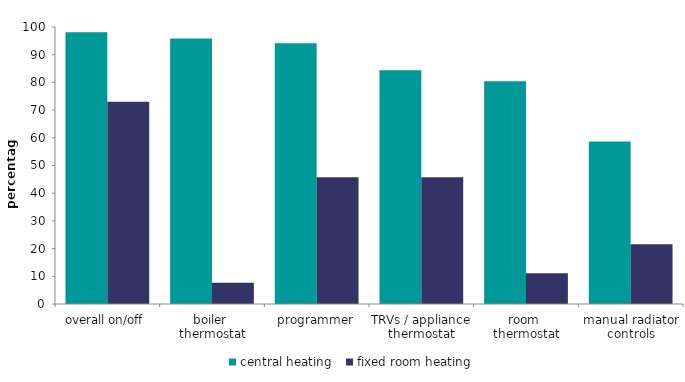
| Category | central heating | fixed room heating |
|---|---|---|
| overall on/off | 98.126 | 72.98 |
| boiler 
thermostat | 95.863 | 7.64 |
| programmer | 94.136 | 45.765 |
| TRVs / appliance thermostat | 84.389 | 45.768 |
| room 
thermostat | 80.456 | 11.092 |
| manual radiator controls | 58.663 | 21.532 |